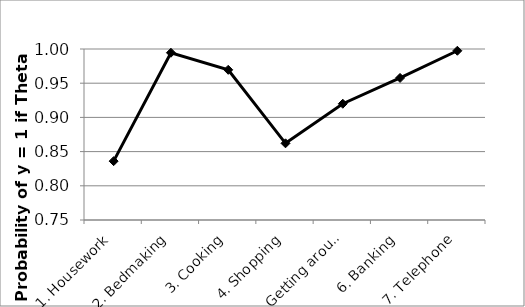
| Category | Series 0 |
|---|---|
| 1. Housework | 0.836 |
| 2. Bedmaking | 0.995 |
| 3. Cooking | 0.97 |
| 4. Shopping | 0.862 |
| 5. Getting around | 0.92 |
| 6. Banking | 0.958 |
| 7. Telephone | 0.997 |